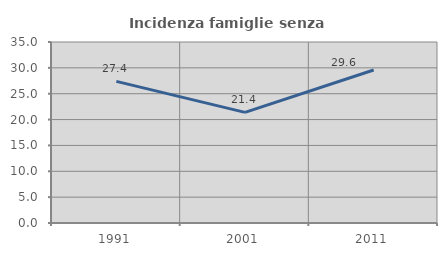
| Category | Incidenza famiglie senza nuclei |
|---|---|
| 1991.0 | 27.385 |
| 2001.0 | 21.386 |
| 2011.0 | 29.594 |